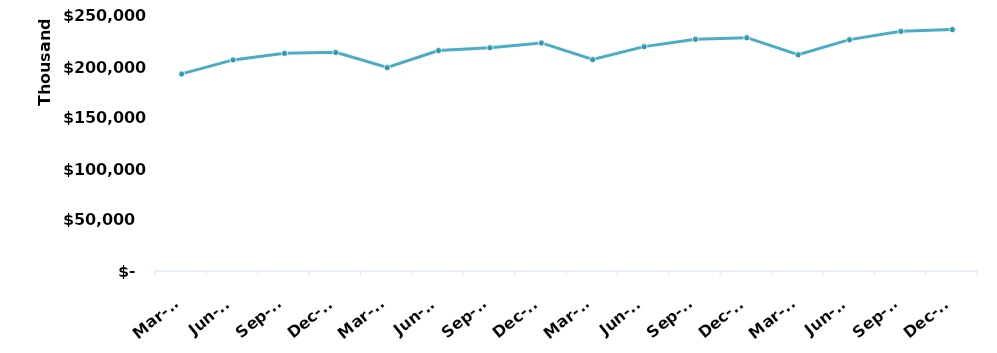
| Category | Total |
|---|---|
| Mar-15 | 193214760.65 |
| Jun-15 | 206971890.35 |
| Sep-15 | 213490881.83 |
| Dec-15 | 214349105.84 |
| Mar-16 | 199493745.37 |
| Jun-16 | 216148419.22 |
| Sep-16 | 218976889.8 |
| Dec-16 | 223617895.79 |
| Mar-17 | 207333812.45 |
| Jun-17 | 219981727.55 |
| Sep-17 | 227293496.76 |
| Dec-17 | 228775828.16 |
| Mar-18 | 212038702.39 |
| Jun-18 | 226827967.75 |
| Sep-18 | 235037993.57 |
| Dec-18 | 236773515.07 |